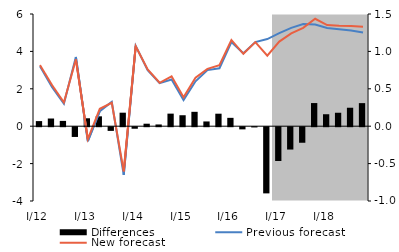
| Category | Differences |
|---|---|
| I/12 | 0.068 |
| II | 0.103 |
| III | 0.071 |
| IV | -0.13 |
| I/13 | 0.106 |
| II | 0.132 |
| III | -0.049 |
| IV | 0.181 |
| I/14 | -0.021 |
| II | 0.033 |
| III | 0.023 |
| IV | 0.168 |
| I/15 | 0.147 |
| II | 0.192 |
| III | 0.064 |
| IV | 0.167 |
| I/16 | 0.112 |
| II | -0.029 |
| III | -0.003 |
| IV | -0.885 |
| I/17 | -0.452 |
| II | -0.299 |
| III | -0.208 |
| IV | 0.309 |
| I/18 | 0.16 |
| II | 0.18 |
| III | 0.247 |
| IV | 0.309 |